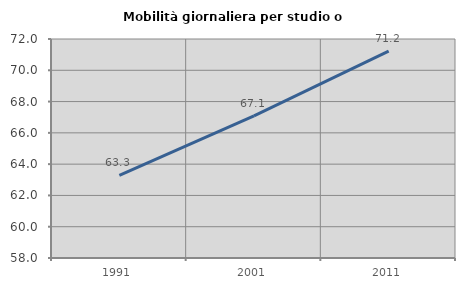
| Category | Mobilità giornaliera per studio o lavoro |
|---|---|
| 1991.0 | 63.276 |
| 2001.0 | 67.084 |
| 2011.0 | 71.222 |